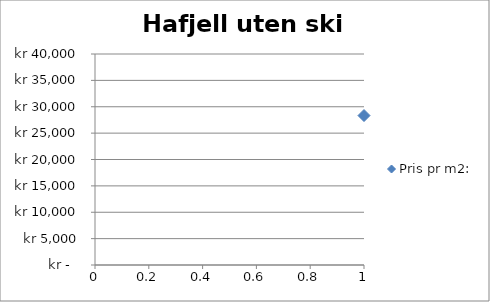
| Category | Pris pr m2: |
|---|---|
| 0 | 28333 |
| 1 | 19000 |
| 2 | 36863 |
| 3 | 22917 |
| 4 | 24333 |
| 5 | 26923 |
| 6 | 29167 |
| 7 | 25929 |
| 8 | 28873 |
| 9 | 25820 |
| 10 | 15692 |
| 11 | 21667 |
| 12 | 22581 |
| 13 | 21724 |
| 14 | 21791 |
| 15 | 25564 |
| 16 | 22419 |
| 17 | 25000 |
| 18 | 32295 |
| 19 | 27632 |
| 20 | 26344 |
| 21 | 26111 |
| 22 | 22414 |
| 23 | 20000 |
| 24 | 25000 |
| 25 | 22759 |
| 26 | 24515 |
| 27 | 26667 |
| 28 | 28070 |
| 29 | 22936 |
| 30 | 25676 |
| 31 | 23684 |
| 32 | 33696 |
| 33 | 28667 |
| 34 | 27500 |
| 35 | 26667 |
| 36 | 20984 |
| 37 | 21642 |
| 38 | 19776 |
| 39 | 27000 |
| 40 | 28448 |
| 41 | 21784 |
| 42 | 27574 |
| 43 | 23583 |
| 44 | 30508 |
| 45 | 25088 |
| 46 | 30645 |
| 47 | 27727 |
| 48 | 20635 |
| 49 | 35000 |
| 50 | 21333 |
| 51 | 27155 |
| 52 | 30097 |
| 53 | 22015 |
| 54 | 25775 |
| 55 | 27049 |
| 56 | 31897 |
| 57 | 26154 |
| 58 | 23333 |
| 59 | 37705 |
| 60 | 27344 |
| 61 | 29016 |
| 62 | 25000 |
| 63 | 33922 |
| 64 | 22500 |
| 65 | 34091 |
| 66 | 27160 |
| 67 | 17931 |
| 68 | 18966 |
| 69 | 23071 |
| 70 | 24667 |
| 71 | 28070 |
| 72 | 27273 |
| 73 | 22680 |
| 74 | 22667 |
| 75 | 23667 |
| 76 | 27500 |
| 77 | 25949 |
| 78 | 22685 |
| 79 | 26967 |
| 80 | 26500 |
| 81 | 27869 |
| 82 | 23070 |
| 83 | 24107 |
| 84 | 22857 |
| 85 | 23220 |
| 86 | 28448 |
| 87 | 24480 |
| 88 | 20833 |
| 89 | 24590 |
| 90 | 12143 |
| 91 | 21071 |
| 92 | 22429 |
| 93 | 32143 |
| 94 | 18687 |
| 95 | 27213 |
| 96 | 23143 |
| 97 | 27100 |
| 98 | 27424 |
| 99 | 25000 |
| 100 | 20345 |
| 101 | 23684 |
| 102 | 22222 |
| 103 | 22000 |
| 104 | 21071 |
| 105 | 22267 |
| 106 | 22267 |